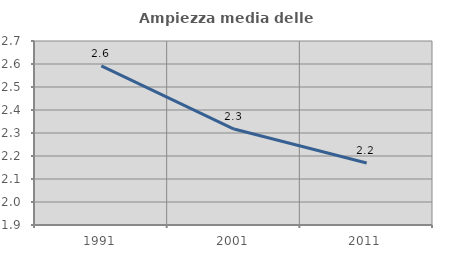
| Category | Ampiezza media delle famiglie |
|---|---|
| 1991.0 | 2.591 |
| 2001.0 | 2.317 |
| 2011.0 | 2.17 |